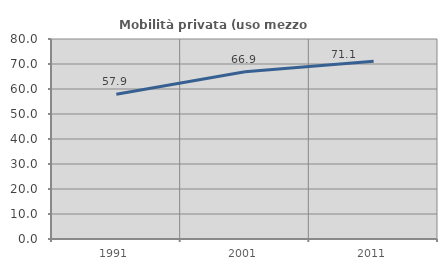
| Category | Mobilità privata (uso mezzo privato) |
|---|---|
| 1991.0 | 57.886 |
| 2001.0 | 66.871 |
| 2011.0 | 71.12 |